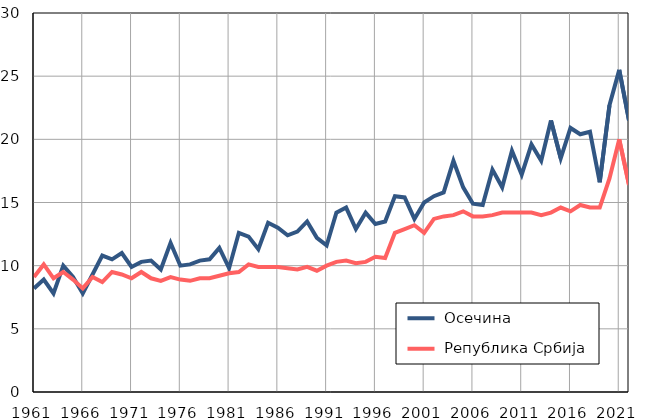
| Category |  Осечина |  Република Србија |
|---|---|---|
| 1961.0 | 8.2 | 9.1 |
| 1962.0 | 8.9 | 10.1 |
| 1963.0 | 7.8 | 9 |
| 1964.0 | 10 | 9.5 |
| 1965.0 | 9.1 | 8.9 |
| 1966.0 | 7.8 | 8.2 |
| 1967.0 | 9.3 | 9.1 |
| 1968.0 | 10.8 | 8.7 |
| 1969.0 | 10.5 | 9.5 |
| 1970.0 | 11 | 9.3 |
| 1971.0 | 9.9 | 9 |
| 1972.0 | 10.3 | 9.5 |
| 1973.0 | 10.4 | 9 |
| 1974.0 | 9.7 | 8.8 |
| 1975.0 | 11.8 | 9.1 |
| 1976.0 | 10 | 8.9 |
| 1977.0 | 10.1 | 8.8 |
| 1978.0 | 10.4 | 9 |
| 1979.0 | 10.5 | 9 |
| 1980.0 | 11.4 | 9.2 |
| 1981.0 | 9.8 | 9.4 |
| 1982.0 | 12.6 | 9.5 |
| 1983.0 | 12.3 | 10.1 |
| 1984.0 | 11.3 | 9.9 |
| 1985.0 | 13.4 | 9.9 |
| 1986.0 | 13 | 9.9 |
| 1987.0 | 12.4 | 9.8 |
| 1988.0 | 12.7 | 9.7 |
| 1989.0 | 13.5 | 9.9 |
| 1990.0 | 12.2 | 9.6 |
| 1991.0 | 11.6 | 10 |
| 1992.0 | 14.2 | 10.3 |
| 1993.0 | 14.6 | 10.4 |
| 1994.0 | 12.9 | 10.2 |
| 1995.0 | 14.2 | 10.3 |
| 1996.0 | 13.3 | 10.7 |
| 1997.0 | 13.5 | 10.6 |
| 1998.0 | 15.5 | 12.6 |
| 1999.0 | 15.4 | 12.9 |
| 2000.0 | 13.7 | 13.2 |
| 2001.0 | 15 | 12.6 |
| 2002.0 | 15.5 | 13.7 |
| 2003.0 | 15.8 | 13.9 |
| 2004.0 | 18.3 | 14 |
| 2005.0 | 16.2 | 14.3 |
| 2006.0 | 14.9 | 13.9 |
| 2007.0 | 14.8 | 13.9 |
| 2008.0 | 17.6 | 14 |
| 2009.0 | 16.2 | 14.2 |
| 2010.0 | 19.1 | 14.2 |
| 2011.0 | 17.2 | 14.2 |
| 2012.0 | 19.6 | 14.2 |
| 2013.0 | 18.3 | 14 |
| 2014.0 | 21.5 | 14.2 |
| 2015.0 | 18.5 | 14.6 |
| 2016.0 | 20.9 | 14.3 |
| 2017.0 | 20.4 | 14.8 |
| 2018.0 | 20.6 | 14.6 |
| 2019.0 | 16.6 | 14.6 |
| 2020.0 | 22.7 | 16.9 |
| 2021.0 | 25.5 | 20 |
| 2022.0 | 21.5 | 16.4 |